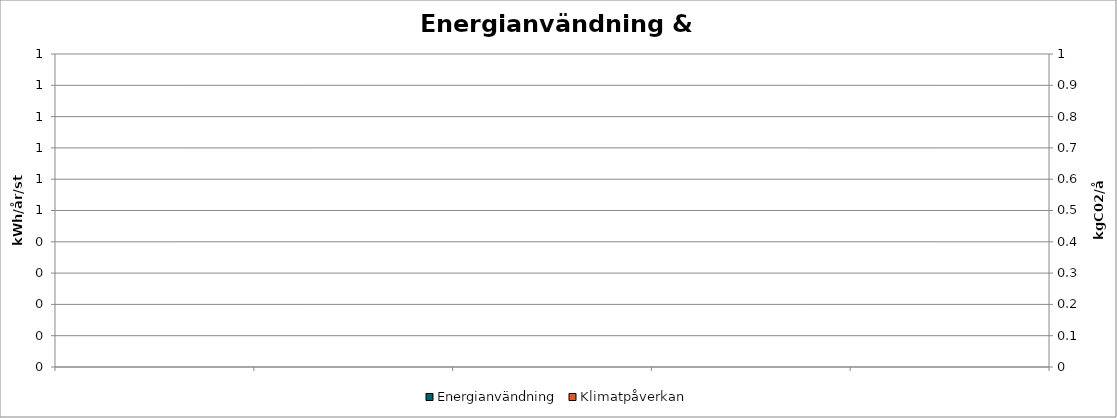
| Category | Energianvändning | dummty |
|---|---|---|
| 0 | 0 |  |
| 1 | 0 |  |
| 2 | 0 |  |
| 3 | 0 |  |
| 4 | 0 |  |